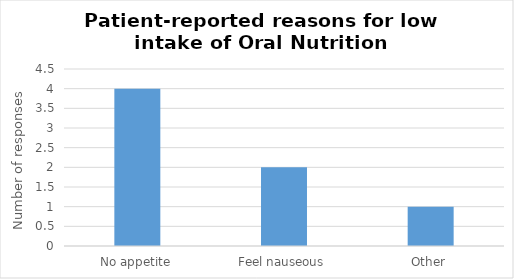
| Category | Series 0 |
|---|---|
| No appetite | 4 |
| Feel nauseous | 2 |
| Other | 1 |